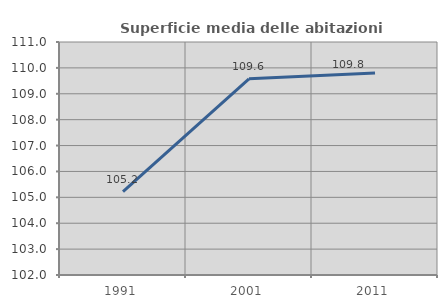
| Category | Superficie media delle abitazioni occupate |
|---|---|
| 1991.0 | 105.217 |
| 2001.0 | 109.576 |
| 2011.0 | 109.803 |